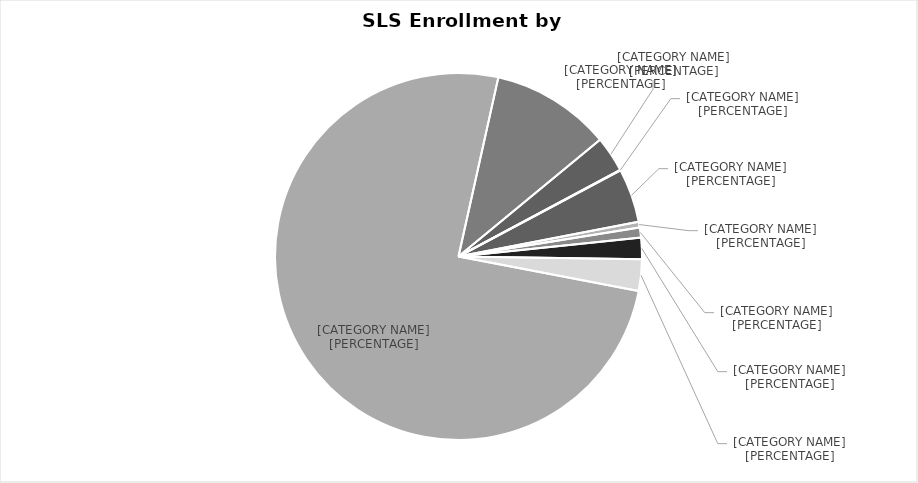
| Category | Total |
|---|---|
| Not Supplied | 336 |
| American Indian/Alaskan Native | 36 |
| African American/Non-Hispanic | 63 |
| Asian/Asian American | 134 |
| Hispanic/Hispanic American | 196 |
| White/Non-Hispanic | 5351 |
| International | 747 |
| Multiracial | 223 |
| Pacific Islander | 4 |